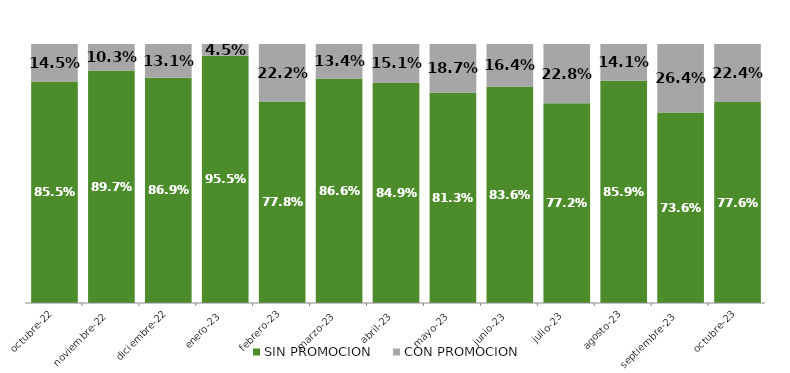
| Category | SIN PROMOCION   | CON PROMOCION   |
|---|---|---|
| 2022-10-01 | 0.855 | 0.145 |
| 2022-11-01 | 0.897 | 0.103 |
| 2022-12-01 | 0.869 | 0.131 |
| 2023-01-01 | 0.955 | 0.045 |
| 2023-02-01 | 0.778 | 0.222 |
| 2023-03-01 | 0.866 | 0.134 |
| 2023-04-01 | 0.849 | 0.151 |
| 2023-05-01 | 0.813 | 0.187 |
| 2023-06-01 | 0.836 | 0.164 |
| 2023-07-01 | 0.772 | 0.228 |
| 2023-08-01 | 0.859 | 0.141 |
| 2023-09-01 | 0.736 | 0.264 |
| 2023-10-01 | 0.776 | 0.224 |